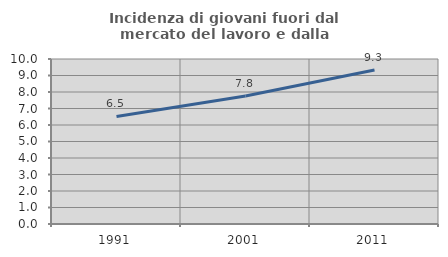
| Category | Incidenza di giovani fuori dal mercato del lavoro e dalla formazione  |
|---|---|
| 1991.0 | 6.516 |
| 2001.0 | 7.762 |
| 2011.0 | 9.328 |